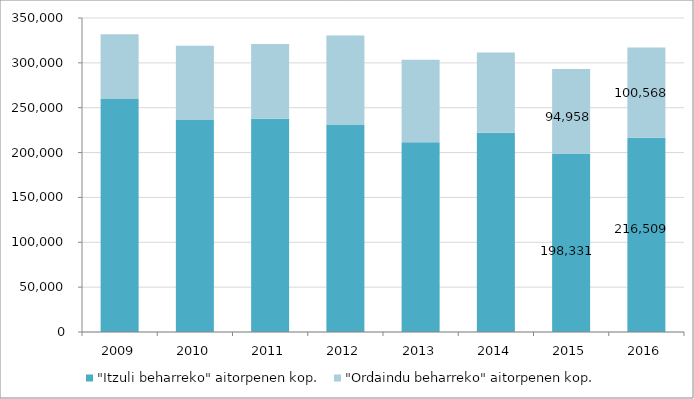
| Category | "Itzuli beharreko" aitorpenen kop. | "Ordaindu beharreko" aitorpenen kop. |
|---|---|---|
| 2009.0 | 259702 | 72208 |
| 2010.0 | 236808 | 82185 |
| 2011.0 | 237625 | 83528 |
| 2012.0 | 230745 | 99745 |
| 2013.0 | 211586 | 91870 |
| 2014.0 | 222131 | 89308 |
| 2015.0 | 198331 | 94958 |
| 2016.0 | 216509 | 100568 |